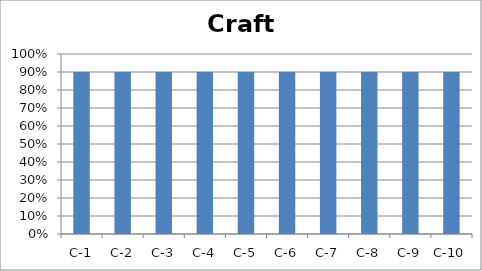
| Category | Craft |
|---|---|
| C-1 | 0.9 |
| C-2 | 0.9 |
| C-3 | 0.9 |
| C-4 | 0.9 |
| C-5 | 0.9 |
| C-6 | 0.9 |
| C-7 | 0.9 |
| C-8 | 0.9 |
| C-9 | 0.9 |
| C-10 | 0.9 |